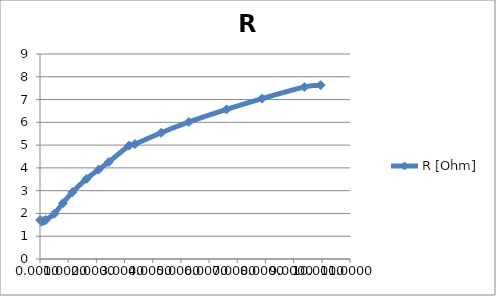
| Category | R [Ohm] |
|---|---|
| 0.0048 | 1.714 |
| 0.043 | 1.68 |
| 0.068 | 1.639 |
| 0.143 | 1.682 |
| 0.209 | 1.713 |
| 0.509 | 1.988 |
| 0.811 | 2.45 |
| 1.15 | 2.934 |
| 1.65 | 3.518 |
| 2.08 | 3.925 |
| 2.44 | 4.258 |
| 3.16 | 4.976 |
| 3.37 | 5.045 |
| 4.3 | 5.541 |
| 5.28 | 6.014 |
| 6.62 | 6.567 |
| 7.88 | 7.042 |
| 9.38 | 7.552 |
| 9.96 | 7.632 |